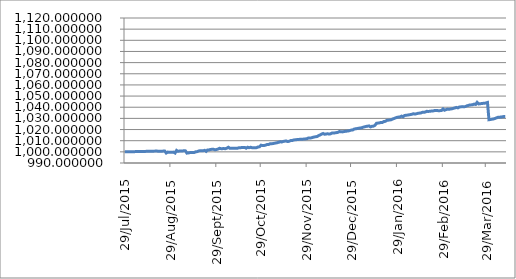
| Category | Series 0 |
|---|---|
| 2015-07-29 | 1000 |
| 2015-07-30 | 1000 |
| 2015-07-31 | 1000 |
| 2015-08-01 | 1000 |
| 2015-08-02 | 1000 |
| 2015-08-03 | 1000.067 |
| 2015-08-04 | 1000.137 |
| 2015-08-05 | 1000.197 |
| 2015-08-06 | 1000.217 |
| 2015-08-07 | 1000.24 |
| 2015-08-08 | 1000.256 |
| 2015-08-09 | 1000.279 |
| 2015-08-10 | 1000.321 |
| 2015-08-11 | 1000.368 |
| 2015-08-12 | 1000.415 |
| 2015-08-13 | 1000.439 |
| 2015-08-14 | 1000.494 |
| 2015-08-15 | 1000.548 |
| 2015-08-16 | 1000.602 |
| 2015-08-17 | 1000.625 |
| 2015-08-18 | 1000.643 |
| 2015-08-19 | 1000.651 |
| 2015-08-20 | 1000.669 |
| 2015-08-21 | 1000.468 |
| 2015-08-22 | 1000.538 |
| 2015-08-23 | 1000.607 |
| 2015-08-24 | 1000.667 |
| 2015-08-25 | 1000.755 |
| 2015-08-26 | 998.938 |
| 2015-08-27 | 999.804 |
| 2015-08-28 | 999.631 |
| 2015-08-29 | 999.681 |
| 2015-08-30 | 999.731 |
| 2015-08-31 | 999.75 |
| 2015-09-01 | 998.953 |
| 2015-09-02 | 1001.297 |
| 2015-09-03 | 1000.464 |
| 2015-09-04 | 1000.725 |
| 2015-09-05 | 1000.777 |
| 2015-09-06 | 1000.829 |
| 2015-09-07 | 1000.923 |
| 2015-09-08 | 1000.875 |
| 2015-09-09 | 998.848 |
| 2015-09-10 | 999.03 |
| 2015-09-11 | 999.308 |
| 2015-09-12 | 999.34 |
| 2015-09-13 | 999.372 |
| 2015-09-14 | 999.493 |
| 2015-09-15 | 1000.032 |
| 2015-09-16 | 1000.214 |
| 2015-09-17 | 1000.842 |
| 2015-09-18 | 1000.92 |
| 2015-09-19 | 1000.949 |
| 2015-09-20 | 1000.978 |
| 2015-09-21 | 1001.354 |
| 2015-09-22 | 1000.417 |
| 2015-09-23 | 1001.691 |
| 2015-09-24 | 1001.72 |
| 2015-09-25 | 1002.198 |
| 2015-09-26 | 1002.226 |
| 2015-09-27 | 1002.255 |
| 2015-09-28 | 1001.822 |
| 2015-09-29 | 1002.133 |
| 2015-09-30 | 1002.471 |
| 2015-10-01 | 1003.173 |
| 2015-10-02 | 1002.855 |
| 2015-10-03 | 1002.883 |
| 2015-10-04 | 1002.911 |
| 2015-10-05 | 1002.837 |
| 2015-10-06 | 1003.352 |
| 2015-10-07 | 1004.133 |
| 2015-10-08 | 1003.155 |
| 2015-10-09 | 1003.155 |
| 2015-10-10 | 1003.187 |
| 2015-10-11 | 1003.218 |
| 2015-10-12 | 1003.301 |
| 2015-10-13 | 1003.218 |
| 2015-10-14 | 1003.617 |
| 2015-10-15 | 1003.577 |
| 2015-10-16 | 1003.917 |
| 2015-10-17 | 1003.949 |
| 2015-10-18 | 1003.981 |
| 2015-10-19 | 1003.263 |
| 2015-10-20 | 1004.133 |
| 2015-10-21 | 1003.707 |
| 2015-10-22 | 1004.095 |
| 2015-10-23 | 1003.682 |
| 2015-10-24 | 1003.714 |
| 2015-10-25 | 1003.746 |
| 2015-10-26 | 1003.776 |
| 2015-10-27 | 1004.39 |
| 2015-10-28 | 1004.498 |
| 2015-10-29 | 1005.954 |
| 2015-10-30 | 1005.695 |
| 2015-10-31 | 1005.692 |
| 2015-11-01 | 1005.955 |
| 2015-11-02 | 1006.487 |
| 2015-11-03 | 1006.487 |
| 2015-11-04 | 1007.161 |
| 2015-11-05 | 1007.288 |
| 2015-11-06 | 1007.39 |
| 2015-11-07 | 1007.679 |
| 2015-11-08 | 1007.933 |
| 2015-11-09 | 1008.186 |
| 2015-11-10 | 1008.576 |
| 2015-11-11 | 1009.129 |
| 2015-11-12 | 1008.798 |
| 2015-11-13 | 1009.302 |
| 2015-11-14 | 1009.552 |
| 2015-11-15 | 1009.801 |
| 2015-11-16 | 1009.221 |
| 2015-11-17 | 1009.446 |
| 2015-11-18 | 1010.075 |
| 2015-11-19 | 1010.084 |
| 2015-11-20 | 1010.625 |
| 2015-11-21 | 1010.791 |
| 2015-11-22 | 1010.95 |
| 2015-11-23 | 1011.121 |
| 2015-11-24 | 1011.184 |
| 2015-11-25 | 1011.365 |
| 2015-11-26 | 1011.362 |
| 2015-11-27 | 1011.441 |
| 2015-11-28 | 1011.608 |
| 2015-11-29 | 1011.774 |
| 2015-11-30 | 1012.407 |
| 2015-12-01 | 1012.415 |
| 2015-12-02 | 1012.547 |
| 2015-12-03 | 1012.977 |
| 2015-12-04 | 1013.309 |
| 2015-12-05 | 1013.54 |
| 2015-12-06 | 1013.77 |
| 2015-12-07 | 1014.633 |
| 2015-12-08 | 1015.155 |
| 2015-12-09 | 1015.949 |
| 2015-12-10 | 1016.466 |
| 2015-12-11 | 1015.791 |
| 2015-12-12 | 1016.01 |
| 2015-12-13 | 1016.23 |
| 2015-12-14 | 1015.906 |
| 2015-12-15 | 1016.135 |
| 2015-12-16 | 1016.863 |
| 2015-12-17 | 1016.787 |
| 2015-12-18 | 1017.011 |
| 2015-12-19 | 1017.231 |
| 2015-12-20 | 1017.451 |
| 2015-12-21 | 1018.233 |
| 2015-12-22 | 1018.037 |
| 2015-12-23 | 1017.889 |
| 2015-12-24 | 1018.184 |
| 2015-12-25 | 1018.368 |
| 2015-12-26 | 1018.553 |
| 2015-12-27 | 1018.737 |
| 2015-12-28 | 1019.088 |
| 2015-12-29 | 1019.514 |
| 2015-12-30 | 1019.641 |
| 2015-12-31 | 1020.433 |
| 2016-01-01 | 1020.674 |
| 2016-01-02 | 1020.914 |
| 2016-01-03 | 1021.154 |
| 2016-01-04 | 1021.395 |
| 2016-01-05 | 1021.615 |
| 2016-01-06 | 1022.094 |
| 2016-01-07 | 1022.428 |
| 2016-01-08 | 1022.783 |
| 2016-01-09 | 1023.024 |
| 2016-01-10 | 1023.265 |
| 2016-01-11 | 1022.39 |
| 2016-01-12 | 1022.893 |
| 2016-01-13 | 1023.037 |
| 2016-01-14 | 1023.785 |
| 2016-01-15 | 1025.587 |
| 2016-01-16 | 1025.775 |
| 2016-01-17 | 1025.964 |
| 2016-01-18 | 1026.407 |
| 2016-01-19 | 1026.362 |
| 2016-01-20 | 1027.157 |
| 2016-01-21 | 1027.345 |
| 2016-01-22 | 1028.206 |
| 2016-01-23 | 1028.395 |
| 2016-01-24 | 1028.583 |
| 2016-01-25 | 1028.772 |
| 2016-01-26 | 1029.459 |
| 2016-01-27 | 1029.915 |
| 2016-01-28 | 1030.529 |
| 2016-01-29 | 1030.982 |
| 2016-01-30 | 1031.17 |
| 2016-01-31 | 1031.362 |
| 2016-02-01 | 1032.041 |
| 2016-02-02 | 1031.477 |
| 2016-02-03 | 1032.588 |
| 2016-02-04 | 1032.796 |
| 2016-02-05 | 1032.953 |
| 2016-02-06 | 1033.196 |
| 2016-02-07 | 1033.438 |
| 2016-02-08 | 1033.727 |
| 2016-02-09 | 1034.145 |
| 2016-02-10 | 1033.853 |
| 2016-02-11 | 1034.141 |
| 2016-02-12 | 1034.53 |
| 2016-02-13 | 1034.711 |
| 2016-02-14 | 1034.893 |
| 2016-02-15 | 1035.421 |
| 2016-02-16 | 1035.42 |
| 2016-02-17 | 1035.718 |
| 2016-02-18 | 1036.357 |
| 2016-02-19 | 1036.193 |
| 2016-02-20 | 1036.374 |
| 2016-02-21 | 1036.555 |
| 2016-02-22 | 1036.554 |
| 2016-02-23 | 1036.956 |
| 2016-02-24 | 1037.11 |
| 2016-02-25 | 1037.107 |
| 2016-02-26 | 1036.826 |
| 2016-02-27 | 1036.946 |
| 2016-02-28 | 1037.066 |
| 2016-02-29 | 1038.491 |
| 2016-03-01 | 1037.313 |
| 2016-03-02 | 1037.833 |
| 2016-03-03 | 1038.319 |
| 2016-03-04 | 1038.182 |
| 2016-03-05 | 1038.391 |
| 2016-03-06 | 1038.599 |
| 2016-03-07 | 1039.012 |
| 2016-03-08 | 1039.401 |
| 2016-03-09 | 1039.836 |
| 2016-03-10 | 1039.422 |
| 2016-03-11 | 1040.167 |
| 2016-03-12 | 1040.36 |
| 2016-03-13 | 1040.552 |
| 2016-03-14 | 1040.449 |
| 2016-03-15 | 1040.562 |
| 2016-03-16 | 1041.223 |
| 2016-03-17 | 1041.598 |
| 2016-03-18 | 1041.995 |
| 2016-03-19 | 1042.107 |
| 2016-03-20 | 1042.219 |
| 2016-03-21 | 1042.84 |
| 2016-03-22 | 1042.498 |
| 2016-03-23 | 1044.377 |
| 2016-03-24 | 1042.944 |
| 2016-03-25 | 1043.122 |
| 2016-03-26 | 1043.301 |
| 2016-03-27 | 1043.479 |
| 2016-03-28 | 1043.614 |
| 2016-03-29 | 1043.79 |
| 2016-03-30 | 1044.267 |
| 2016-03-31 | 1028.804 |
| 2016-04-01 | 1029.021 |
| 2016-04-02 | 1029.252 |
| 2016-04-03 | 1029.483 |
| 2016-04-04 | 1029.895 |
| 2016-04-05 | 1030.425 |
| 2016-04-06 | 1030.93 |
| 2016-04-07 | 1031.016 |
| 2016-04-08 | 1031.203 |
| 2016-04-09 | 1031.424 |
| 2016-04-10 | 1031.645 |
| 2016-04-11 | 1031.675 |